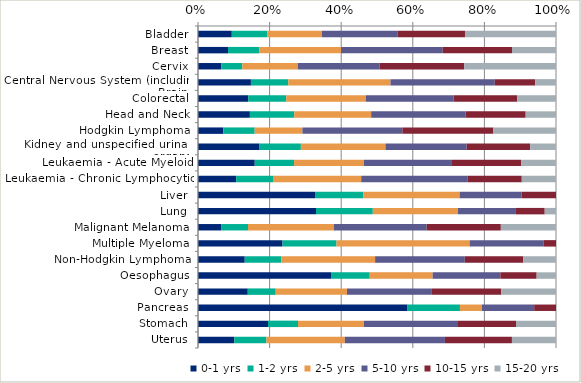
| Category | 0-1 yrs | 1-2 yrs | 2-5 yrs | 5-10 yrs | 10-15 yrs | 15-20 yrs |
|---|---|---|---|---|---|---|
| Bladder | 0.094 | 0.099 | 0.153 | 0.211 | 0.189 | 0.254 |
| Breast | 0.084 | 0.088 | 0.228 | 0.284 | 0.193 | 0.123 |
| Cervix | 0.065 | 0.059 | 0.155 | 0.228 | 0.237 | 0.256 |
| Central Nervous System (including Brain) | 0.148 | 0.104 | 0.286 | 0.291 | 0.113 | 0.058 |
| Colorectal | 0.14 | 0.106 | 0.222 | 0.245 | 0.178 | 0.108 |
| Head and Neck | 0.145 | 0.124 | 0.215 | 0.264 | 0.168 | 0.085 |
| Hodgkin Lymphoma | 0.071 | 0.088 | 0.133 | 0.279 | 0.254 | 0.175 |
| Kidney and unspecified urinary organs | 0.172 | 0.115 | 0.236 | 0.227 | 0.178 | 0.072 |
| Leukaemia - Acute Myeloid | 0.159 | 0.11 | 0.195 | 0.244 | 0.195 | 0.098 |
| Leukaemia - Chronic Lymphocytic | 0.107 | 0.103 | 0.246 | 0.298 | 0.151 | 0.096 |
| Liver | 0.327 | 0.135 | 0.269 | 0.173 | 0.096 | 0 |
| Lung | 0.33 | 0.159 | 0.238 | 0.162 | 0.08 | 0.032 |
| Malignant Melanoma | 0.065 | 0.075 | 0.24 | 0.259 | 0.207 | 0.154 |
| Multiple Myeloma | 0.236 | 0.151 | 0.372 | 0.206 | 0.035 | 0 |
| Non-Hodgkin Lymphoma | 0.131 | 0.102 | 0.262 | 0.251 | 0.163 | 0.091 |
| Oesophagus | 0.372 | 0.108 | 0.176 | 0.189 | 0.101 | 0.054 |
| Ovary | 0.139 | 0.078 | 0.199 | 0.237 | 0.193 | 0.153 |
| Pancreas | 0.585 | 0.146 | 0.061 | 0.146 | 0.061 | 0 |
| Stomach | 0.196 | 0.084 | 0.184 | 0.263 | 0.162 | 0.112 |
| Uterus | 0.102 | 0.09 | 0.219 | 0.28 | 0.187 | 0.123 |